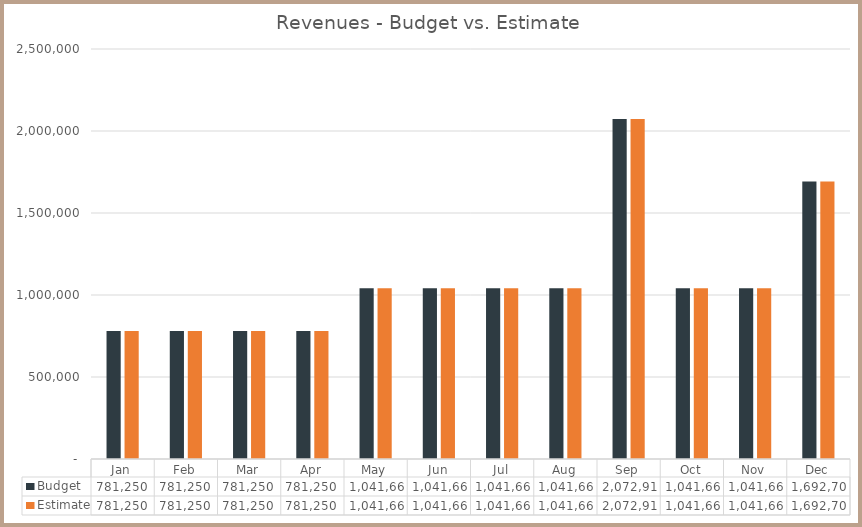
| Category | Budget | Estimate |
|---|---|---|
| Jan | 781250 | 781250 |
| Feb | 781250 | 781250 |
| Mar | 781250 | 781250 |
| Apr | 781250 | 781250 |
| May | 1041666.667 | 1041666.667 |
| Jun | 1041666.667 | 1041666.667 |
| Jul | 1041666.667 | 1041666.667 |
| Aug | 1041666.667 | 1041666.667 |
| Sep | 2072916.667 | 2072916.667 |
| Oct | 1041666.667 | 1041666.667 |
| Nov | 1041666.667 | 1041666.667 |
| Dec | 1692708.333 | 1692708.333 |